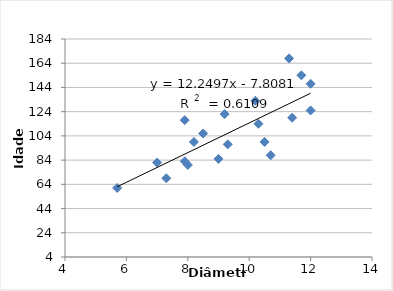
| Category | Idade (y) |
|---|---|
| 12.0 | 125 |
| 11.4 | 119 |
| 7.9 | 83 |
| 9.0 | 85 |
| 10.5 | 99 |
| 7.9 | 117 |
| 7.3 | 69 |
| 10.2 | 133 |
| 11.7 | 154 |
| 11.3 | 168 |
| 5.7 | 61 |
| 8.0 | 80 |
| 10.3 | 114 |
| 12.0 | 147 |
| 9.2 | 122 |
| 8.5 | 106 |
| 7.0 | 82 |
| 10.7 | 88 |
| 9.3 | 97 |
| 8.2 | 99 |